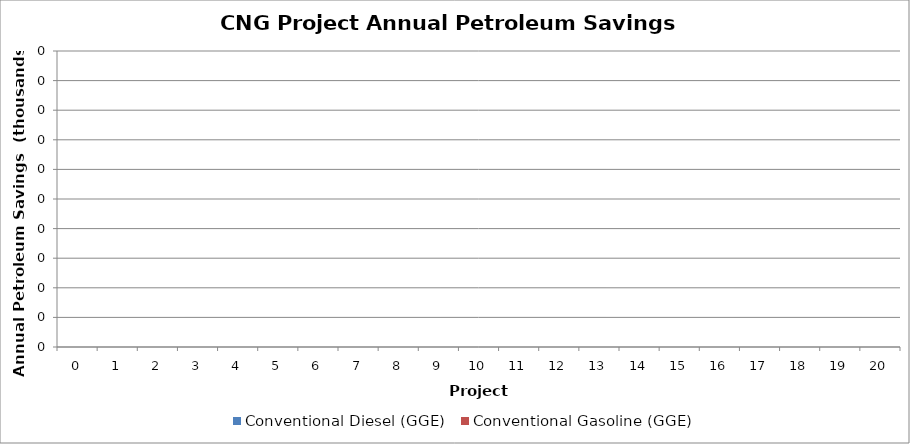
| Category | Conventional Diesel (GGE) | Conventional Gasoline (GGE) |
|---|---|---|
| 0.0 | 0 | 0 |
| 1.0 | 0 | 0 |
| 2.0 | 0 | 0 |
| 3.0 | 0 | 0 |
| 4.0 | 0 | 0 |
| 5.0 | 0 | 0 |
| 6.0 | 0 | 0 |
| 7.0 | 0 | 0 |
| 8.0 | 0 | 0 |
| 9.0 | 0 | 0 |
| 10.0 | 0 | 0 |
| 11.0 | 0 | 0 |
| 12.0 | 0 | 0 |
| 13.0 | 0 | 0 |
| 14.0 | 0 | 0 |
| 15.0 | 0 | 0 |
| 16.0 | 0 | 0 |
| 17.0 | 0 | 0 |
| 18.0 | 0 | 0 |
| 19.0 | 0 | 0 |
| 20.0 | 0 | 0 |